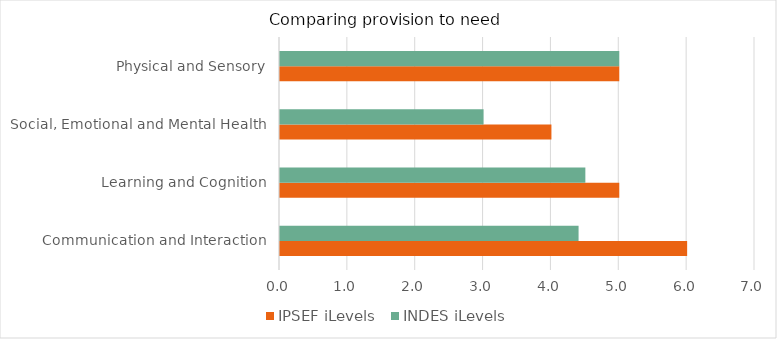
| Category | IPSEF iLevels  | INDES iLevels |
|---|---|---|
| Communication and Interaction | 6 | 4.4 |
| Learning and Cognition | 5 | 4.5 |
| Social, Emotional and Mental Health | 4 | 3 |
| Physical and Sensory | 5 | 5 |